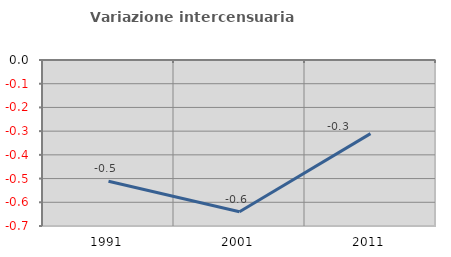
| Category | Variazione intercensuaria annua |
|---|---|
| 1991.0 | -0.512 |
| 2001.0 | -0.64 |
| 2011.0 | -0.31 |